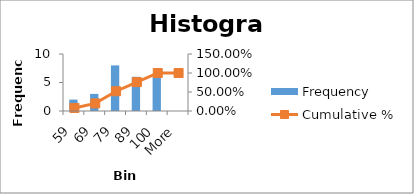
| Category | Frequency |
|---|---|
| 59 | 2 |
| 69 | 3 |
| 79 | 8 |
| 89 | 6 |
| 100 | 6 |
| More | 0 |